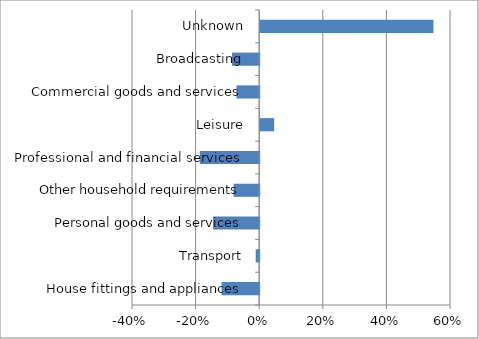
| Category | Series 0 |
|---|---|
| House fittings and appliances | -0.118 |
| Transport | -0.011 |
| Personal goods and services | -0.145 |
| Other household requirements | -0.08 |
| Professional and financial services | -0.187 |
| Leisure | 0.044 |
| Commercial goods and services | -0.071 |
| Broadcasting | -0.086 |
| Unknown | 0.545 |